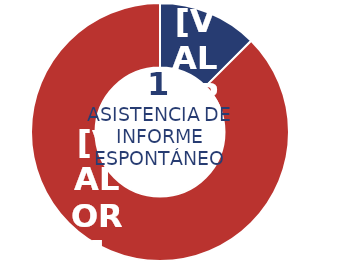
| Category | Series 0 |
|---|---|
| Física | 1 |
| Jurídica | 7 |